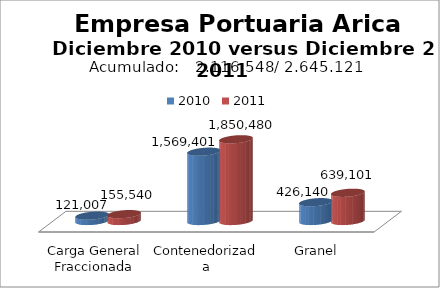
| Category | 2010 | 2011 |
|---|---|---|
| Carga General Fraccionada | 121007 | 155540 |
| Contenedorizada | 1569401 | 1850480 |
| Granel | 426140 | 639101 |